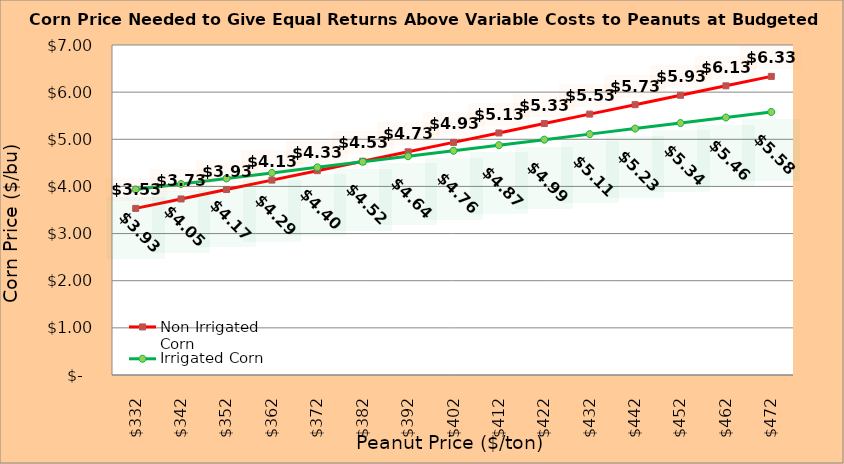
| Category | Non Irrigated Corn | Irrigated Corn |
|---|---|---|
| 332.02127659574467 | 3.534 | 3.935 |
| 342.02127659574467 | 3.734 | 4.052 |
| 352.02127659574467 | 3.934 | 4.17 |
| 362.02127659574467 | 4.134 | 4.287 |
| 372.02127659574467 | 4.334 | 4.405 |
| 382.02127659574467 | 4.534 | 4.522 |
| 392.02127659574467 | 4.734 | 4.64 |
| 402.02127659574467 | 4.934 | 4.757 |
| 412.02127659574467 | 5.134 | 4.875 |
| 422.02127659574467 | 5.334 | 4.992 |
| 432.02127659574467 | 5.534 | 5.11 |
| 442.02127659574467 | 5.734 | 5.227 |
| 452.02127659574467 | 5.934 | 5.345 |
| 462.02127659574467 | 6.134 | 5.462 |
| 472.02127659574467 | 6.334 | 5.58 |